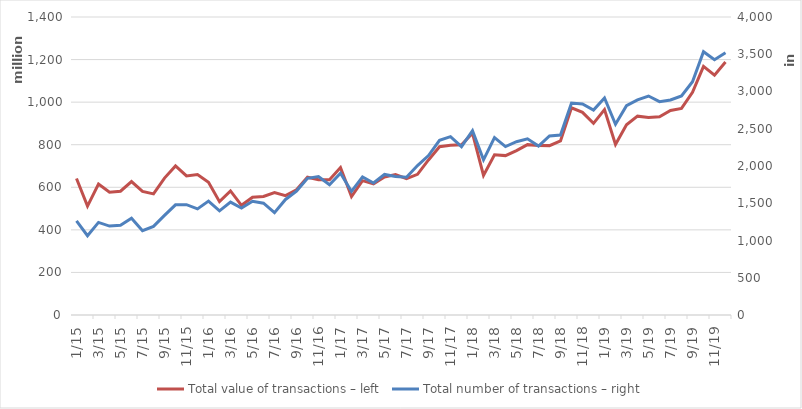
| Category | Total |
|---|---|
| 2015-01-01 | 641299671 |
| 2015-02-01 | 511688951 |
| 2015-03-01 | 615585263 |
| 2015-04-01 | 576421064 |
| 2015-05-01 | 581511130 |
| 2015-06-01 | 627062614 |
| 2015-07-01 | 580709895 |
| 2015-08-01 | 568948581 |
| 2015-09-01 | 643329372 |
| 2015-10-01 | 700607232 |
| 2015-11-01 | 653154508 |
| 2015-12-01 | 659735271 |
| 2016-01-01 | 623719958 |
| 2016-02-01 | 532385709 |
| 2016-03-01 | 582836319 |
| 2016-04-01 | 515291890 |
| 2016-05-01 | 553441839 |
| 2016-06-01 | 556836864 |
| 2016-07-01 | 575613675 |
| 2016-08-01 | 560806298 |
| 2016-09-01 | 588038057 |
| 2016-10-01 | 647245989 |
| 2016-11-01 | 635952032 |
| 2016-12-01 | 635268256 |
| 2017-01-01 | 692948345 |
| 2017-02-01 | 556418837 |
| 2017-03-01 | 631091280 |
| 2017-04-01 | 615993630 |
| 2017-05-01 | 648629380 |
| 2017-06-01 | 659859183 |
| 2017-07-01 | 640128686 |
| 2017-08-01 | 660847615 |
| 2017-09-01 | 728459665 |
| 2017-10-01 | 790689068 |
| 2017-11-01 | 797055016 |
| 2017-12-01 | 799872308 |
| 2018-01-01 | 853592153 |
| 2018-02-01 | 655926827 |
| 2018-03-01 | 752870032 |
| 2018-04-01 | 748849650 |
| 2018-05-01 | 772607012 |
| 2018-06-01 | 800347667 |
| 2018-07-01 | 796226717 |
| 2018-08-01 | 795722806 |
| 2018-09-01 | 817671052 |
| 2018-10-01 | 973090121 |
| 2018-11-01 | 951940506 |
| 2018-12-01 | 900339566 |
| 2019-01-01 | 964859478.141 |
| 2019-02-01 | 801230409.391 |
| 2019-03-01 | 893619939.186 |
| 2019-04-01 | 934260221.069 |
| 2019-05-01 | 928013285.13 |
| 2019-06-01 | 931594027.121 |
| 2019-07-01 | 960824947.818 |
| 2019-08-01 | 970372664.504 |
| 2019-09-01 | 1046414153.182 |
| 2019-10-01 | 1167784591.403 |
| 2019-11-01 | 1126379975.393 |
| 2019-12-01 | 1188209702.989 |